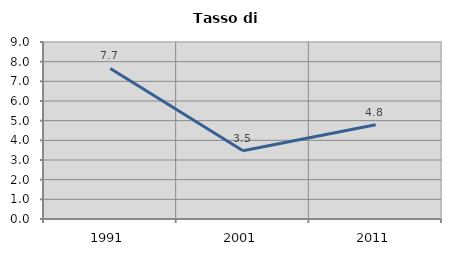
| Category | Tasso di disoccupazione   |
|---|---|
| 1991.0 | 7.654 |
| 2001.0 | 3.473 |
| 2011.0 | 4.791 |